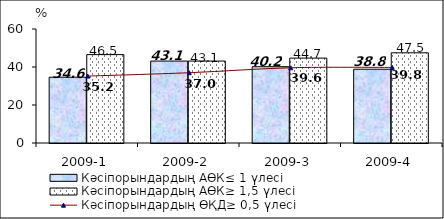
| Category | Кәсіпорындардың АӨК≤ 1 үлесі | Кәсіпорындардың АӨК≥ 1,5 үлесі |
|---|---|---|
| 2009-1 | 34.628 | 46.515 |
| 2009-2 | 43.128 | 43.128 |
| 2009-3 | 40.161 | 44.677 |
| 2009-4 | 38.825 | 47.471 |